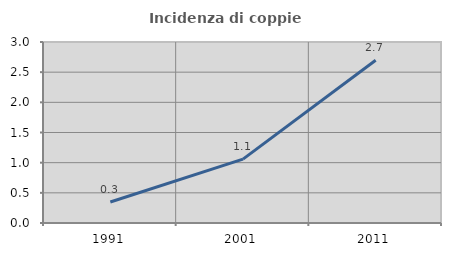
| Category | Incidenza di coppie miste |
|---|---|
| 1991.0 | 0.348 |
| 2001.0 | 1.059 |
| 2011.0 | 2.697 |